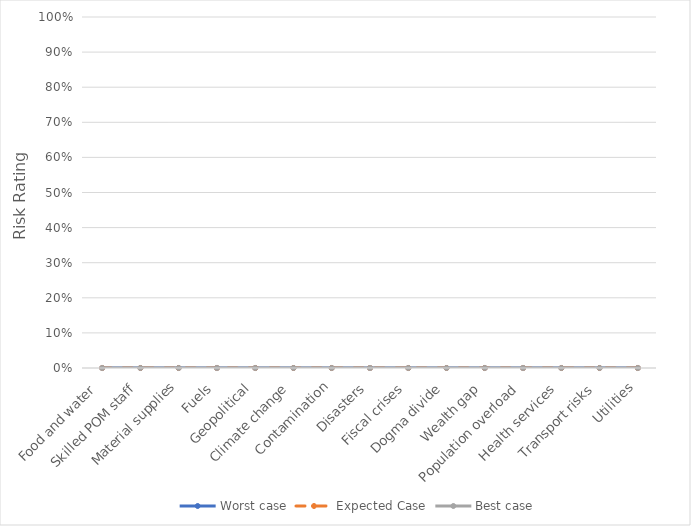
| Category | Worst case | Expected Case | Best case |
|---|---|---|---|
| Food and water | 0 | 0 | 0 |
| Skilled POM staff | 0 | 0 | 0 |
| Material supplies | 0 | 0 | 0 |
| Fuels | 0 | 0 | 0 |
| Geopolitical | 0 | 0 | 0 |
| Climate change | 0 | 0 | 0 |
| Contamination | 0 | 0 | 0 |
| Disasters | 0 | 0 | 0 |
| Fiscal crises | 0 | 0 | 0 |
| Dogma divide | 0 | 0 | 0 |
| Wealth gap | 0 | 0 | 0 |
| Population overload | 0 | 0 | 0 |
| Health services | 0 | 0 | 0 |
| Transport risks | 0 | 0 | 0 |
| Utilities | 0 | 0 | 0 |